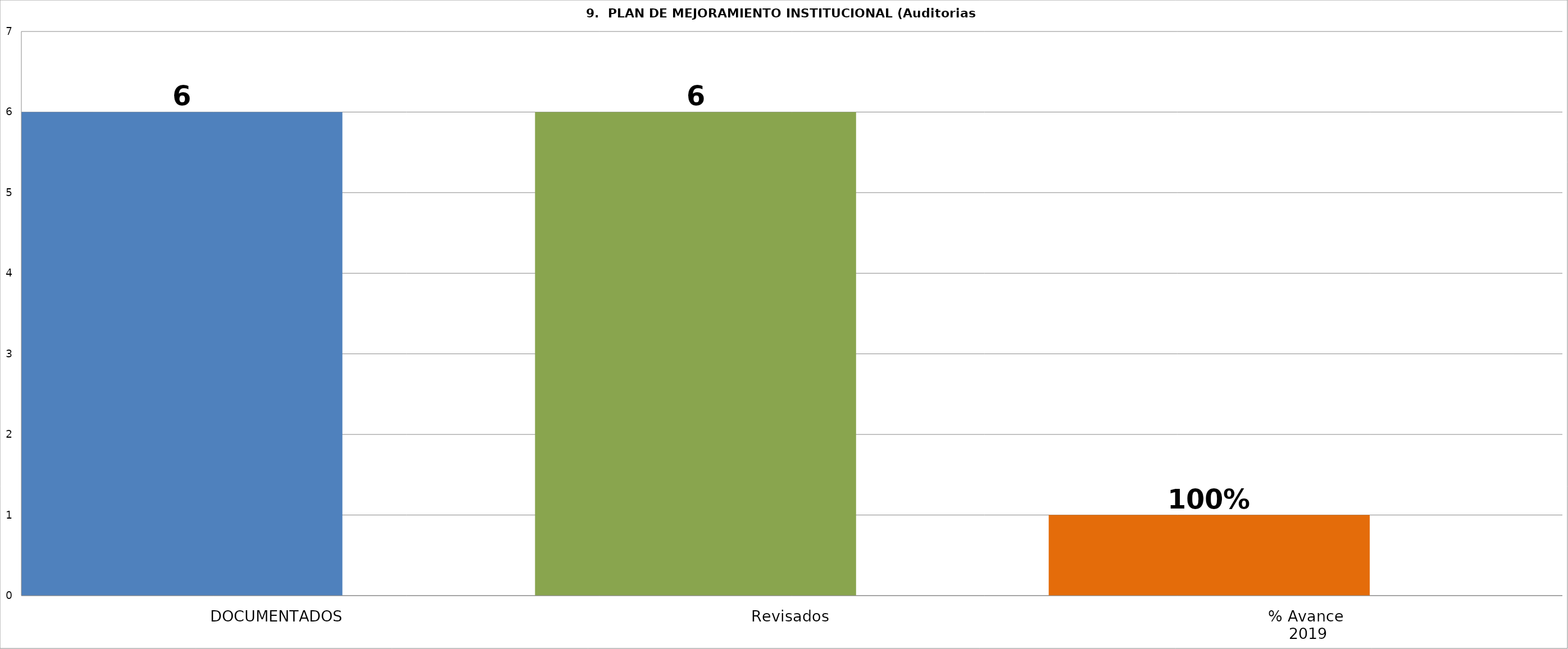
| Category | Series 2 | Series 4 | Series 0 | Series 1 | Series 7 |
|---|---|---|---|---|---|
| DOCUMENTADOS | 6 |  |  |  |  |
| Revisados | 6 |  |  |  |  |
| % Avance
 2019 | 1 |  |  |  |  |